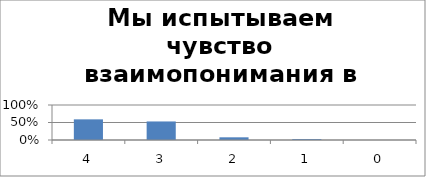
| Category | Мы испытываем чувство взаимопонимания в контактах с админитсрацией и учителями |
|---|---|
| 4.0 | 0.59 |
| 3.0 | 0.53 |
| 2.0 | 0.077 |
| 1.0 | 0.026 |
| 0.0 | 0 |